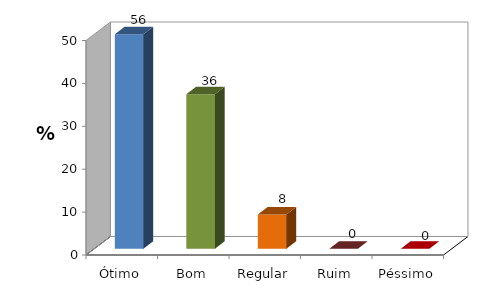
| Category | Series 0 |
|---|---|
| Ótimo | 56 |
| Bom | 36 |
| Regular | 8 |
| Ruim | 0 |
| Péssimo | 0 |